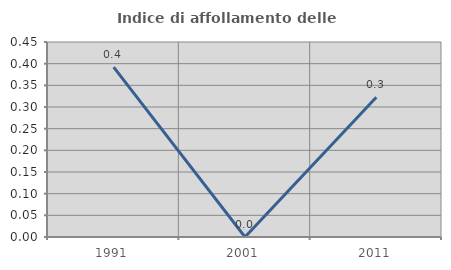
| Category | Indice di affollamento delle abitazioni  |
|---|---|
| 1991.0 | 0.392 |
| 2001.0 | 0 |
| 2011.0 | 0.323 |